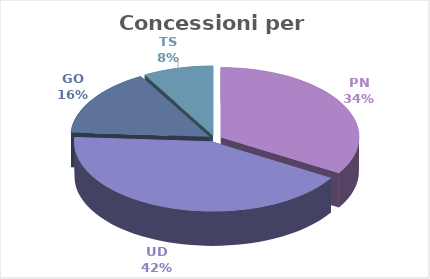
| Category | Series 0 |
|---|---|
| PN | 38696035 |
| UD | 48659730 |
| GO | 18155500 |
| TS | 9445000 |